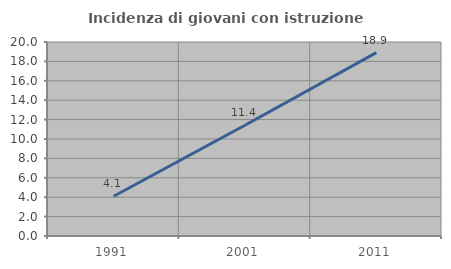
| Category | Incidenza di giovani con istruzione universitaria |
|---|---|
| 1991.0 | 4.098 |
| 2001.0 | 11.421 |
| 2011.0 | 18.901 |